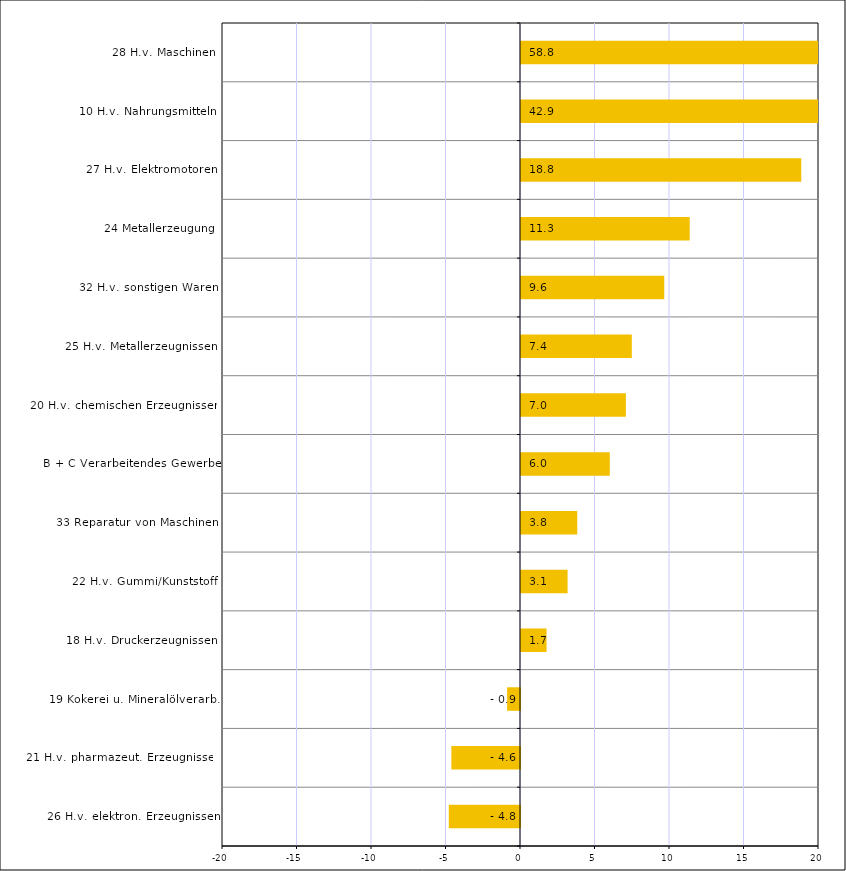
| Category | Series 0 |
|---|---|
| 26 H.v. elektron. Erzeugnissen | -4.779 |
| 21 H.v. pharmazeut. Erzeugnissen | -4.606 |
| 19 Kokerei u. Mineralölverarb. | -0.867 |
| 18 H.v. Druckerzeugnissen | 1.715 |
| 22 H.v. Gummi/Kunststoff | 3.127 |
| 33 Reparatur von Maschinen | 3.775 |
| B + C Verarbeitendes Gewerbe | 5.96 |
| 20 H.v. chemischen Erzeugnissen | 7.04 |
| 25 H.v. Metallerzeugnissen | 7.438 |
| 32 H.v. sonstigen Waren | 9.613 |
| 24 Metallerzeugung | 11.324 |
| 27 H.v. Elektromotoren | 18.809 |
| 10 H.v. Nahrungsmitteln | 42.939 |
| 28 H.v. Maschinen | 58.779 |